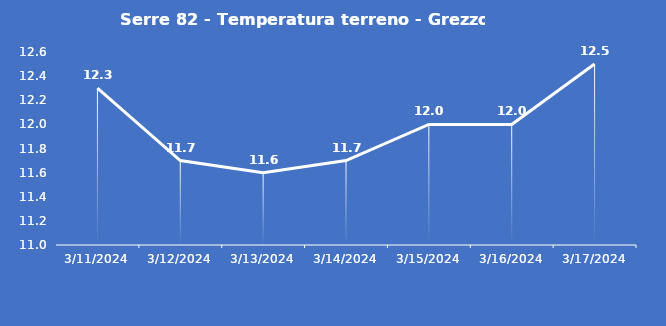
| Category | Serre 82 - Temperatura terreno - Grezzo (°C) |
|---|---|
| 3/11/24 | 12.3 |
| 3/12/24 | 11.7 |
| 3/13/24 | 11.6 |
| 3/14/24 | 11.7 |
| 3/15/24 | 12 |
| 3/16/24 | 12 |
| 3/17/24 | 12.5 |